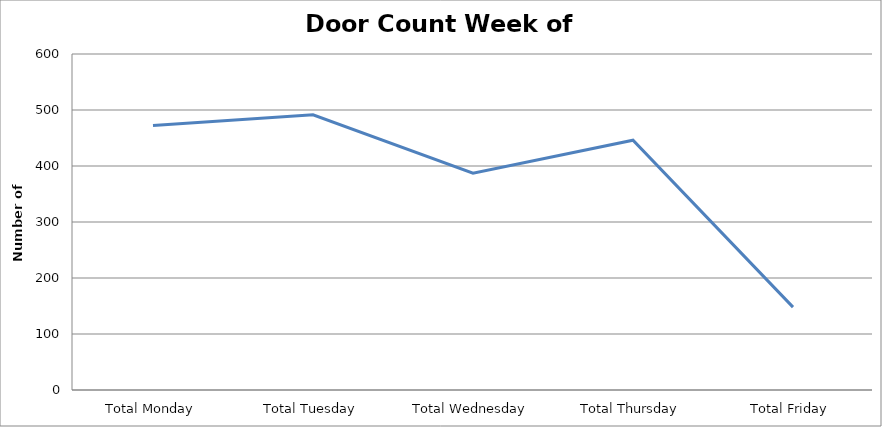
| Category | Series 0 |
|---|---|
| Total Monday | 472.5 |
| Total Tuesday | 491.5 |
| Total Wednesday | 387 |
| Total Thursday | 446 |
| Total Friday | 148 |